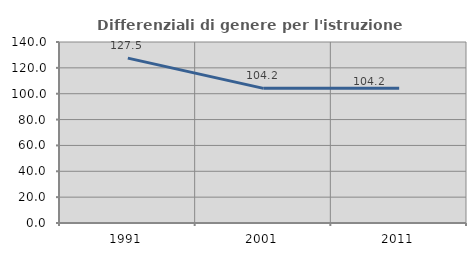
| Category | Differenziali di genere per l'istruzione superiore |
|---|---|
| 1991.0 | 127.542 |
| 2001.0 | 104.156 |
| 2011.0 | 104.22 |